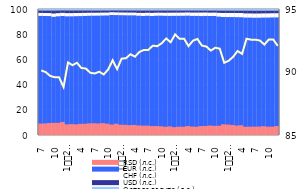
| Category | RSD (л.с.) | EUR (л.с.) | CHF (л.с.) | USD (л.с.) | Остале валуте (л.с.) |
|---|---|---|---|---|---|
| 7 | 9.876 | 85.43 | 1.603 | 2.628 | 0.463 |
| 8 | 10.008 | 85.208 | 1.603 | 2.689 | 0.492 |
| 9 | 10.311 | 84.86 | 1.629 | 2.711 | 0.49 |
| 10 | 10.413 | 84.165 | 1.881 | 3.045 | 0.496 |
| 11 | 10.425 | 84.569 | 1.734 | 2.83 | 0.442 |
| 12 | 11.188 | 84.042 | 1.769 | 2.605 | 0.395 |
| 1
2009. | 9.24 | 85.724 | 1.782 | 2.831 | 0.422 |
| 2 | 9.458 | 85.524 | 1.763 | 2.823 | 0.432 |
| 3 | 9.27 | 85.828 | 1.738 | 2.741 | 0.424 |
| 4 | 9.682 | 85.469 | 1.725 | 2.699 | 0.425 |
| 5 | 9.724 | 85.569 | 1.708 | 2.566 | 0.432 |
| 6 | 10.068 | 85.36 | 1.648 | 2.492 | 0.433 |
| 7 | 10.115 | 85.37 | 1.61 | 2.46 | 0.446 |
| 8 | 9.977 | 85.528 | 1.604 | 2.438 | 0.452 |
| 9 | 10.198 | 85.428 | 1.58 | 2.357 | 0.438 |
| 10 | 9.798 | 85.869 | 1.566 | 2.324 | 0.444 |
| 11 | 9.072 | 86.943 | 1.452 | 2.142 | 0.39 |
| 12 | 9.77 | 86.189 | 1.43 | 2.229 | 0.383 |
| 1
2010. | 8.941 | 86.931 | 1.457 | 2.281 | 0.39 |
| 2 | 8.905 | 86.91 | 1.452 | 2.33 | 0.403 |
| 3 | 8.589 | 87.15 | 1.483 | 2.366 | 0.411 |
| 4 | 8.784 | 86.968 | 1.463 | 2.371 | 0.414 |
| 5 | 8.405 | 87.039 | 1.52 | 2.59 | 0.446 |
| 6 | 8.248 | 87.014 | 1.656 | 2.62 | 0.461 |
| 7 | 8.245 | 87.215 | 1.621 | 2.457 | 0.462 |
| 8 | 7.91 | 87.348 | 1.714 | 2.563 | 0.466 |
| 9 | 7.952 | 87.502 | 1.686 | 2.414 | 0.446 |
| 10 | 7.717 | 87.785 | 1.648 | 2.397 | 0.452 |
| 11 | 7.341 | 88.037 | 1.71 | 2.479 | 0.433 |
| 12 | 7.637 | 87.676 | 1.823 | 2.425 | 0.439 |
| 1
2011. | 7.016 | 88.347 | 1.817 | 2.386 | 0.434 |
| 2 | 7.37 | 87.996 | 1.823 | 2.371 | 0.44 |
| 3 | 7.354 | 88.074 | 1.805 | 2.324 | 0.443 |
| 4 | 7.945 | 87.579 | 1.807 | 2.221 | 0.447 |
| 5 | 7.515 | 87.803 | 1.911 | 2.315 | 0.454 |
| 6 | 7.377 | 87.927 | 1.938 | 2.308 | 0.45 |
| 7 | 7.904 | 87.283 | 2.056 | 2.295 | 0.462 |
| 8 | 7.98 | 87.307 | 1.991 | 2.247 | 0.475 |
| 9 | 8.301 | 86.921 | 1.94 | 2.369 | 0.469 |
| 10 | 8.073 | 87.169 | 1.977 | 2.309 | 0.473 |
| 11 | 8.146 | 86.605 | 2.259 | 2.48 | 0.509 |
| 12 | 9.27 | 85.174 | 2.419 | 2.595 | 0.541 |
| 1
2012. | 9.109 | 85.301 | 2.458 | 2.583 | 0.55 |
| 2 | 8.794 | 85.59 | 2.493 | 2.564 | 0.558 |
| 3 | 8.333 | 85.981 | 2.527 | 2.594 | 0.565 |
| 4 | 8.562 | 85.696 | 2.544 | 2.621 | 0.575 |
| 5 | 7.362 | 86.627 | 2.577 | 2.844 | 0.59 |
| 6 | 7.433 | 86.525 | 2.599 | 2.848 | 0.595 |
| 7 | 7.433 | 86.42 | 2.609 | 2.917 | 0.62 |
| 8 | 7.505 | 86.376 | 2.615 | 2.885 | 0.62 |
| 9 | 7.823 | 86.159 | 2.592 | 2.797 | 0.629 |
| 10 | 7.416 | 86.573 | 2.606 | 2.792 | 0.612 |
| 11 | 7.427 | 86.67 | 2.57 | 2.735 | 0.598 |
| 12 | 7.927 | 86.21 | 2.556 | 2.701 | 0.606 |